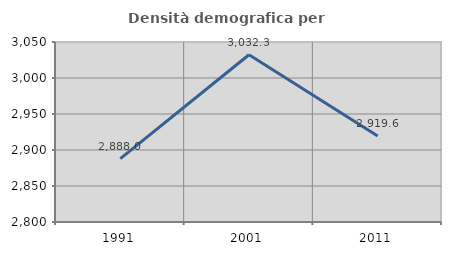
| Category | Densità demografica |
|---|---|
| 1991.0 | 2887.985 |
| 2001.0 | 3032.284 |
| 2011.0 | 2919.557 |